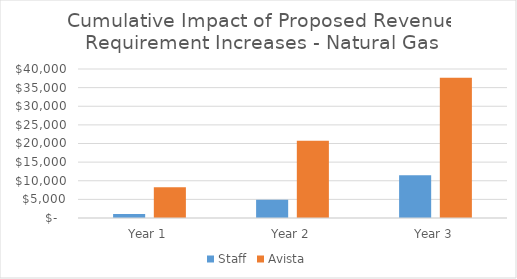
| Category | Staff | Avista |
|---|---|---|
| Year 1 | 1106.716 | 8269 |
| Year 2 | 4911.444 | 20758 |
| Year 3 | 11500.487 | 37664 |